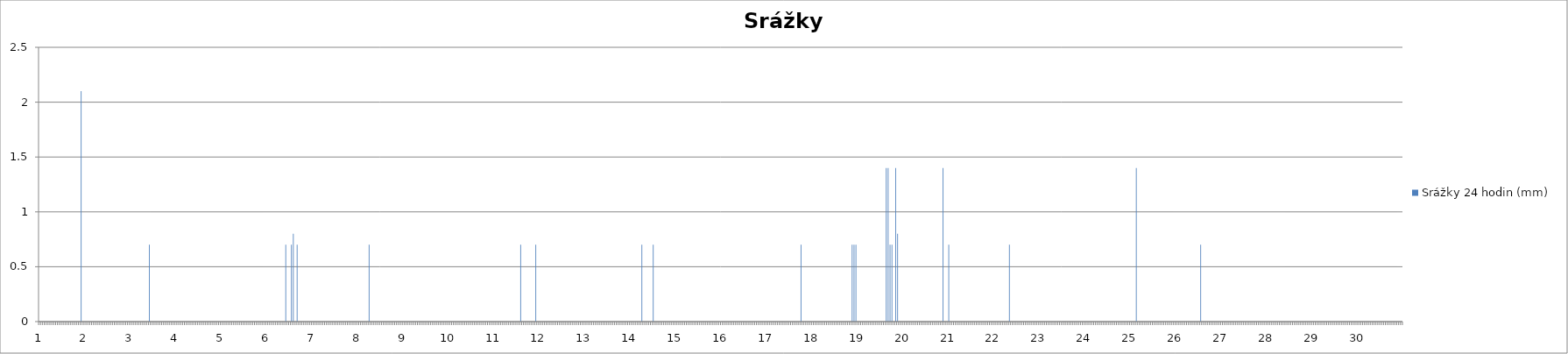
| Category | Srážky 24 hodin (mm) |
|---|---|
| 0 | 0 |
| 1 | 0 |
| 2 | 0 |
| 3 | 0 |
| 4 | 0 |
| 5 | 0 |
| 6 | 0 |
| 7 | 0 |
| 8 | 0 |
| 9 | 0 |
| 10 | 0 |
| 11 | 0 |
| 12 | 0 |
| 13 | 0 |
| 14 | 0 |
| 15 | 0 |
| 16 | 0 |
| 17 | 0 |
| 18 | 0 |
| 19 | 0 |
| 20 | 0 |
| 21 | 0 |
| 22 | 2.1 |
| 23 | 0 |
| 24 | 0 |
| 25 | 0 |
| 26 | 0 |
| 27 | 0 |
| 28 | 0 |
| 29 | 0 |
| 30 | 0 |
| 31 | 0 |
| 32 | 0 |
| 33 | 0 |
| 34 | 0 |
| 35 | 0 |
| 36 | 0 |
| 37 | 0 |
| 38 | 0 |
| 39 | 0 |
| 40 | 0 |
| 41 | 0 |
| 42 | 0 |
| 43 | 0 |
| 44 | 0 |
| 45 | 0 |
| 46 | 0 |
| 47 | 0 |
| 48 | 0 |
| 49 | 0 |
| 50 | 0 |
| 51 | 0 |
| 52 | 0 |
| 53 | 0 |
| 54 | 0 |
| 55 | 0 |
| 56 | 0 |
| 57 | 0 |
| 58 | 0.7 |
| 59 | 0 |
| 60 | 0 |
| 61 | 0 |
| 62 | 0 |
| 63 | 0 |
| 64 | 0 |
| 65 | 0 |
| 66 | 0 |
| 67 | 0 |
| 68 | 0 |
| 69 | 0 |
| 70 | 0 |
| 71 | 0 |
| 72 | 0 |
| 73 | 0 |
| 74 | 0 |
| 75 | 0 |
| 76 | 0 |
| 77 | 0 |
| 78 | 0 |
| 79 | 0 |
| 80 | 0 |
| 81 | 0 |
| 82 | 0 |
| 83 | 0 |
| 84 | 0 |
| 85 | 0 |
| 86 | 0 |
| 87 | 0 |
| 88 | 0 |
| 89 | 0 |
| 90 | 0 |
| 91 | 0 |
| 92 | 0 |
| 93 | 0 |
| 94 | 0 |
| 95 | 0 |
| 96 | 0 |
| 97 | 0 |
| 98 | 0 |
| 99 | 0 |
| 100 | 0 |
| 101 | 0 |
| 102 | 0 |
| 103 | 0 |
| 104 | 0 |
| 105 | 0 |
| 106 | 0 |
| 107 | 0 |
| 108 | 0 |
| 109 | 0 |
| 110 | 0 |
| 111 | 0 |
| 112 | 0 |
| 113 | 0 |
| 114 | 0 |
| 115 | 0 |
| 116 | 0 |
| 117 | 0 |
| 118 | 0 |
| 119 | 0 |
| 120 | 0 |
| 121 | 0 |
| 122 | 0 |
| 123 | 0 |
| 124 | 0 |
| 125 | 0 |
| 126 | 0 |
| 127 | 0 |
| 128 | 0 |
| 129 | 0 |
| 130 | 0.7 |
| 131 | 0 |
| 132 | 0 |
| 133 | 0.7 |
| 134 | 0.8 |
| 135 | 0 |
| 136 | 0.7 |
| 137 | 0 |
| 138 | 0 |
| 139 | 0 |
| 140 | 0 |
| 141 | 0 |
| 142 | 0 |
| 143 | 0 |
| 144 | 0 |
| 145 | 0 |
| 146 | 0 |
| 147 | 0 |
| 148 | 0 |
| 149 | 0 |
| 150 | 0 |
| 151 | 0 |
| 152 | 0 |
| 153 | 0 |
| 154 | 0 |
| 155 | 0 |
| 156 | 0 |
| 157 | 0 |
| 158 | 0 |
| 159 | 0 |
| 160 | 0 |
| 161 | 0 |
| 162 | 0 |
| 163 | 0 |
| 164 | 0 |
| 165 | 0 |
| 166 | 0 |
| 167 | 0 |
| 168 | 0 |
| 169 | 0 |
| 170 | 0 |
| 171 | 0 |
| 172 | 0 |
| 173 | 0 |
| 174 | 0.7 |
| 175 | 0 |
| 176 | 0 |
| 177 | 0 |
| 178 | 0 |
| 179 | 0 |
| 180 | 0 |
| 181 | 0 |
| 182 | 0 |
| 183 | 0 |
| 184 | 0 |
| 185 | 0 |
| 186 | 0 |
| 187 | 0 |
| 188 | 0 |
| 189 | 0 |
| 190 | 0 |
| 191 | 0 |
| 192 | 0 |
| 193 | 0 |
| 194 | 0 |
| 195 | 0 |
| 196 | 0 |
| 197 | 0 |
| 198 | 0 |
| 199 | 0 |
| 200 | 0 |
| 201 | 0 |
| 202 | 0 |
| 203 | 0 |
| 204 | 0 |
| 205 | 0 |
| 206 | 0 |
| 207 | 0 |
| 208 | 0 |
| 209 | 0 |
| 210 | 0 |
| 211 | 0 |
| 212 | 0 |
| 213 | 0 |
| 214 | 0 |
| 215 | 0 |
| 216 | 0 |
| 217 | 0 |
| 218 | 0 |
| 219 | 0 |
| 220 | 0 |
| 221 | 0 |
| 222 | 0 |
| 223 | 0 |
| 224 | 0 |
| 225 | 0 |
| 226 | 0 |
| 227 | 0 |
| 228 | 0 |
| 229 | 0 |
| 230 | 0 |
| 231 | 0 |
| 232 | 0 |
| 233 | 0 |
| 234 | 0 |
| 235 | 0 |
| 236 | 0 |
| 237 | 0 |
| 238 | 0 |
| 239 | 0 |
| 240 | 0 |
| 241 | 0 |
| 242 | 0 |
| 243 | 0 |
| 244 | 0 |
| 245 | 0 |
| 246 | 0 |
| 247 | 0 |
| 248 | 0 |
| 249 | 0 |
| 250 | 0 |
| 251 | 0 |
| 252 | 0 |
| 253 | 0 |
| 254 | 0.7 |
| 255 | 0 |
| 256 | 0 |
| 257 | 0 |
| 258 | 0 |
| 259 | 0 |
| 260 | 0 |
| 261 | 0 |
| 262 | 0.7 |
| 263 | 0 |
| 264 | 0 |
| 265 | 0 |
| 266 | 0 |
| 267 | 0 |
| 268 | 0 |
| 269 | 0 |
| 270 | 0 |
| 271 | 0 |
| 272 | 0 |
| 273 | 0 |
| 274 | 0 |
| 275 | 0 |
| 276 | 0 |
| 277 | 0 |
| 278 | 0 |
| 279 | 0 |
| 280 | 0 |
| 281 | 0 |
| 282 | 0 |
| 283 | 0 |
| 284 | 0 |
| 285 | 0 |
| 286 | 0 |
| 287 | 0 |
| 288 | 0 |
| 289 | 0 |
| 290 | 0 |
| 291 | 0 |
| 292 | 0 |
| 293 | 0 |
| 294 | 0 |
| 295 | 0 |
| 296 | 0 |
| 297 | 0 |
| 298 | 0 |
| 299 | 0 |
| 300 | 0 |
| 301 | 0 |
| 302 | 0 |
| 303 | 0 |
| 304 | 0 |
| 305 | 0 |
| 306 | 0 |
| 307 | 0 |
| 308 | 0 |
| 309 | 0 |
| 310 | 0 |
| 311 | 0 |
| 312 | 0 |
| 313 | 0 |
| 314 | 0 |
| 315 | 0 |
| 316 | 0 |
| 317 | 0 |
| 318 | 0.7 |
| 319 | 0 |
| 320 | 0 |
| 321 | 0 |
| 322 | 0 |
| 323 | 0 |
| 324 | 0.7 |
| 325 | 0 |
| 326 | 0 |
| 327 | 0 |
| 328 | 0 |
| 329 | 0 |
| 330 | 0 |
| 331 | 0 |
| 332 | 0 |
| 333 | 0 |
| 334 | 0 |
| 335 | 0 |
| 336 | 0 |
| 337 | 0 |
| 338 | 0 |
| 339 | 0 |
| 340 | 0 |
| 341 | 0 |
| 342 | 0 |
| 343 | 0 |
| 344 | 0 |
| 345 | 0 |
| 346 | 0 |
| 347 | 0 |
| 348 | 0 |
| 349 | 0 |
| 350 | 0 |
| 351 | 0 |
| 352 | 0 |
| 353 | 0 |
| 354 | 0 |
| 355 | 0 |
| 356 | 0 |
| 357 | 0 |
| 358 | 0 |
| 359 | 0 |
| 360 | 0 |
| 361 | 0 |
| 362 | 0 |
| 363 | 0 |
| 364 | 0 |
| 365 | 0 |
| 366 | 0 |
| 367 | 0 |
| 368 | 0 |
| 369 | 0 |
| 370 | 0 |
| 371 | 0 |
| 372 | 0 |
| 373 | 0 |
| 374 | 0 |
| 375 | 0 |
| 376 | 0 |
| 377 | 0 |
| 378 | 0 |
| 379 | 0 |
| 380 | 0 |
| 381 | 0 |
| 382 | 0 |
| 383 | 0 |
| 384 | 0 |
| 385 | 0 |
| 386 | 0 |
| 387 | 0 |
| 388 | 0 |
| 389 | 0 |
| 390 | 0 |
| 391 | 0 |
| 392 | 0 |
| 393 | 0 |
| 394 | 0 |
| 395 | 0 |
| 396 | 0 |
| 397 | 0 |
| 398 | 0 |
| 399 | 0 |
| 400 | 0 |
| 401 | 0 |
| 402 | 0.7 |
| 403 | 0 |
| 404 | 0 |
| 405 | 0 |
| 406 | 0 |
| 407 | 0 |
| 408 | 0 |
| 409 | 0 |
| 410 | 0 |
| 411 | 0 |
| 412 | 0 |
| 413 | 0 |
| 414 | 0 |
| 415 | 0 |
| 416 | 0 |
| 417 | 0 |
| 418 | 0 |
| 419 | 0 |
| 420 | 0 |
| 421 | 0 |
| 422 | 0 |
| 423 | 0 |
| 424 | 0 |
| 425 | 0 |
| 426 | 0 |
| 427 | 0 |
| 428 | 0 |
| 429 | 0.7 |
| 430 | 0.7 |
| 431 | 0.7 |
| 432 | 0 |
| 433 | 0 |
| 434 | 0 |
| 435 | 0 |
| 436 | 0 |
| 437 | 0 |
| 438 | 0 |
| 439 | 0 |
| 440 | 0 |
| 441 | 0 |
| 442 | 0 |
| 443 | 0 |
| 444 | 0 |
| 445 | 0 |
| 446 | 0 |
| 447 | 1.4 |
| 448 | 1.4 |
| 449 | 0.7 |
| 450 | 0.7 |
| 451 | 0 |
| 452 | 1.4 |
| 453 | 0.8 |
| 454 | 0 |
| 455 | 0 |
| 456 | 0 |
| 457 | 0 |
| 458 | 0 |
| 459 | 0 |
| 460 | 0 |
| 461 | 0 |
| 462 | 0 |
| 463 | 0 |
| 464 | 0 |
| 465 | 0 |
| 466 | 0 |
| 467 | 0 |
| 468 | 0 |
| 469 | 0 |
| 470 | 0 |
| 471 | 0 |
| 472 | 0 |
| 473 | 0 |
| 474 | 0 |
| 475 | 0 |
| 476 | 0 |
| 477 | 1.4 |
| 478 | 0 |
| 479 | 0 |
| 480 | 0.7 |
| 481 | 0 |
| 482 | 0 |
| 483 | 0 |
| 484 | 0 |
| 485 | 0 |
| 486 | 0 |
| 487 | 0 |
| 488 | 0 |
| 489 | 0 |
| 490 | 0 |
| 491 | 0 |
| 492 | 0 |
| 493 | 0 |
| 494 | 0 |
| 495 | 0 |
| 496 | 0 |
| 497 | 0 |
| 498 | 0 |
| 499 | 0 |
| 500 | 0 |
| 501 | 0 |
| 502 | 0 |
| 503 | 0 |
| 504 | 0 |
| 505 | 0 |
| 506 | 0 |
| 507 | 0 |
| 508 | 0 |
| 509 | 0 |
| 510 | 0 |
| 511 | 0 |
| 512 | 0.7 |
| 513 | 0 |
| 514 | 0 |
| 515 | 0 |
| 516 | 0 |
| 517 | 0 |
| 518 | 0 |
| 519 | 0 |
| 520 | 0 |
| 521 | 0 |
| 522 | 0 |
| 523 | 0 |
| 524 | 0 |
| 525 | 0 |
| 526 | 0 |
| 527 | 0 |
| 528 | 0 |
| 529 | 0 |
| 530 | 0 |
| 531 | 0 |
| 532 | 0 |
| 533 | 0 |
| 534 | 0 |
| 535 | 0 |
| 536 | 0 |
| 537 | 0 |
| 538 | 0 |
| 539 | 0 |
| 540 | 0 |
| 541 | 0 |
| 542 | 0 |
| 543 | 0 |
| 544 | 0 |
| 545 | 0 |
| 546 | 0 |
| 547 | 0 |
| 548 | 0 |
| 549 | 0 |
| 550 | 0 |
| 551 | 0 |
| 552 | 0 |
| 553 | 0 |
| 554 | 0 |
| 555 | 0 |
| 556 | 0 |
| 557 | 0 |
| 558 | 0 |
| 559 | 0 |
| 560 | 0 |
| 561 | 0 |
| 562 | 0 |
| 563 | 0 |
| 564 | 0 |
| 565 | 0 |
| 566 | 0 |
| 567 | 0 |
| 568 | 0 |
| 569 | 0 |
| 570 | 0 |
| 571 | 0 |
| 572 | 0 |
| 573 | 0 |
| 574 | 0 |
| 575 | 0 |
| 576 | 0 |
| 577 | 0 |
| 578 | 0 |
| 579 | 1.4 |
| 580 | 0 |
| 581 | 0 |
| 582 | 0 |
| 583 | 0 |
| 584 | 0 |
| 585 | 0 |
| 586 | 0 |
| 587 | 0 |
| 588 | 0 |
| 589 | 0 |
| 590 | 0 |
| 591 | 0 |
| 592 | 0 |
| 593 | 0 |
| 594 | 0 |
| 595 | 0 |
| 596 | 0 |
| 597 | 0 |
| 598 | 0 |
| 599 | 0 |
| 600 | 0 |
| 601 | 0 |
| 602 | 0 |
| 603 | 0 |
| 604 | 0 |
| 605 | 0 |
| 606 | 0 |
| 607 | 0 |
| 608 | 0 |
| 609 | 0 |
| 610 | 0 |
| 611 | 0 |
| 612 | 0 |
| 613 | 0.7 |
| 614 | 0 |
| 615 | 0 |
| 616 | 0 |
| 617 | 0 |
| 618 | 0 |
| 619 | 0 |
| 620 | 0 |
| 621 | 0 |
| 622 | 0 |
| 623 | 0 |
| 624 | 0 |
| 625 | 0 |
| 626 | 0 |
| 627 | 0 |
| 628 | 0 |
| 629 | 0 |
| 630 | 0 |
| 631 | 0 |
| 632 | 0 |
| 633 | 0 |
| 634 | 0 |
| 635 | 0 |
| 636 | 0 |
| 637 | 0 |
| 638 | 0 |
| 639 | 0 |
| 640 | 0 |
| 641 | 0 |
| 642 | 0 |
| 643 | 0 |
| 644 | 0 |
| 645 | 0 |
| 646 | 0 |
| 647 | 0 |
| 648 | 0 |
| 649 | 0 |
| 650 | 0 |
| 651 | 0 |
| 652 | 0 |
| 653 | 0 |
| 654 | 0 |
| 655 | 0 |
| 656 | 0 |
| 657 | 0 |
| 658 | 0 |
| 659 | 0 |
| 660 | 0 |
| 661 | 0 |
| 662 | 0 |
| 663 | 0 |
| 664 | 0 |
| 665 | 0 |
| 666 | 0 |
| 667 | 0 |
| 668 | 0 |
| 669 | 0 |
| 670 | 0 |
| 671 | 0 |
| 672 | 0 |
| 673 | 0 |
| 674 | 0 |
| 675 | 0 |
| 676 | 0 |
| 677 | 0 |
| 678 | 0 |
| 679 | 0 |
| 680 | 0 |
| 681 | 0 |
| 682 | 0 |
| 683 | 0 |
| 684 | 0 |
| 685 | 0 |
| 686 | 0 |
| 687 | 0 |
| 688 | 0 |
| 689 | 0 |
| 690 | 0 |
| 691 | 0 |
| 692 | 0 |
| 693 | 0 |
| 694 | 0 |
| 695 | 0 |
| 696 | 0 |
| 697 | 0 |
| 698 | 0 |
| 699 | 0 |
| 700 | 0 |
| 701 | 0 |
| 702 | 0 |
| 703 | 0 |
| 704 | 0 |
| 705 | 0 |
| 706 | 0 |
| 707 | 0 |
| 708 | 0 |
| 709 | 0 |
| 710 | 0 |
| 711 | 0 |
| 712 | 0 |
| 713 | 0 |
| 714 | 0 |
| 715 | 0 |
| 716 | 0 |
| 717 | 0 |
| 718 | 0 |
| 719 | 0 |